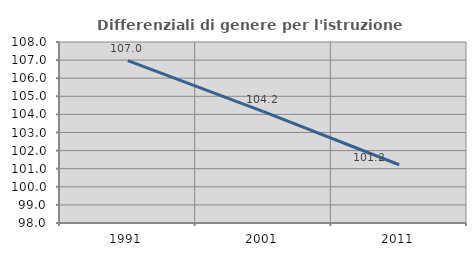
| Category | Differenziali di genere per l'istruzione superiore |
|---|---|
| 1991.0 | 106.97 |
| 2001.0 | 104.15 |
| 2011.0 | 101.219 |